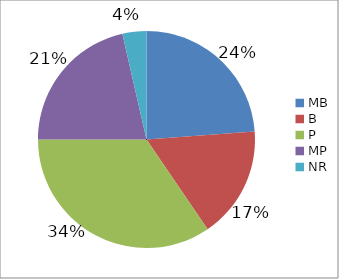
| Category | Series 0 |
|---|---|
| MB | 0.238 |
| B | 0.167 |
| P | 0.345 |
| MP | 0.214 |
| NR | 0.036 |